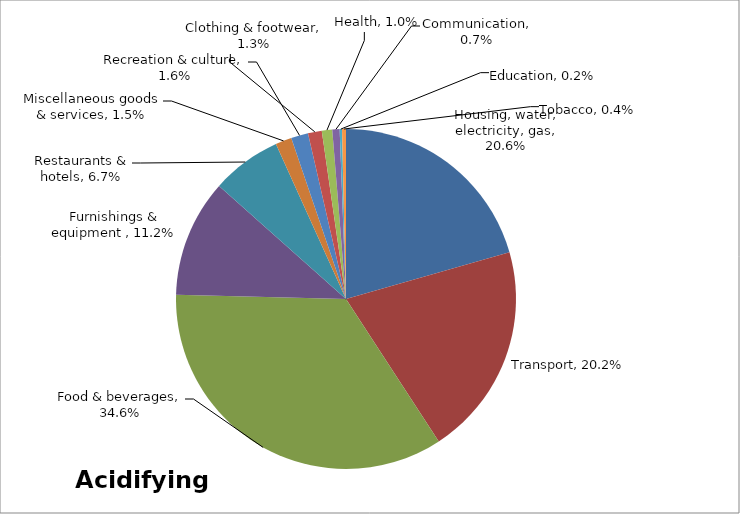
| Category | Acidifying emissions  |
|---|---|
| Housing, water, electricity, gas | 0.206 |
| Transport | 0.202 |
| Food & beverages | 0.346 |
| Furnishings & equipment  | 0.112 |
| Restaurants & hotels | 0.067 |
| Miscellaneous goods & services | 0.015 |
| Recreation & culture | 0.016 |
| Clothing & footwear | 0.013 |
| Health | 0.01 |
| Communication | 0.007 |
| Education | 0.002 |
| Tobacco | 0.004 |